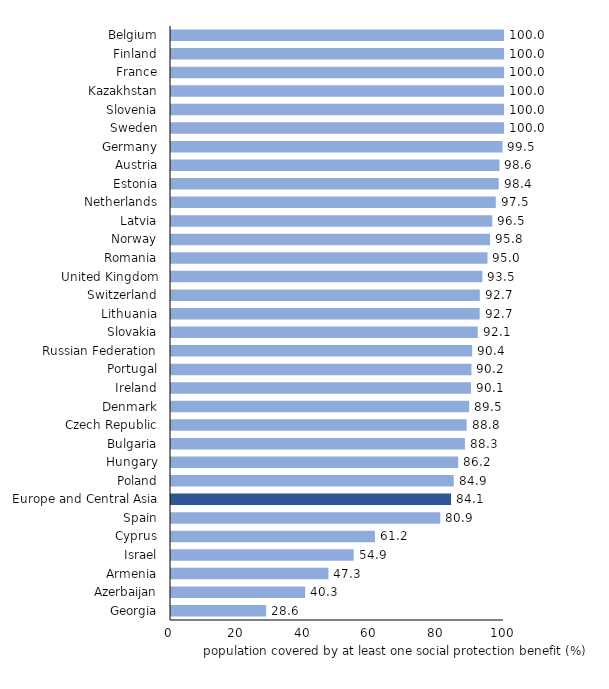
| Category | Population covered by at least one social protection benefit, % of total population |
|---|---|
| Georgia | 28.568 |
| Azerbaijan | 40.297 |
| Armenia | 47.28 |
| Israel | 54.862 |
| Cyprus | 61.239 |
| Spain | 80.863 |
|  Europe and Central Asia | 84.1 |
| Poland | 84.91 |
| Hungary | 86.227 |
| Bulgaria | 88.263 |
| Czech Republic | 88.8 |
| Denmark | 89.54 |
| Ireland | 90.093 |
| Portugal | 90.236 |
| Russian Federation | 90.442 |
| Slovakia | 92.113 |
| Lithuania | 92.689 |
| Switzerland | 92.733 |
| United Kingdom | 93.501 |
| Romania | 95.042 |
| Norway | 95.789 |
| Latvia | 96.484 |
| Netherlands | 97.538 |
| Estonia | 98.391 |
| Austria | 98.638 |
| Germany | 99.547 |
| Sweden | 100 |
| Slovenia | 100 |
| Kazakhstan | 100 |
| France | 100 |
| Finland | 100 |
| Belgium | 100 |